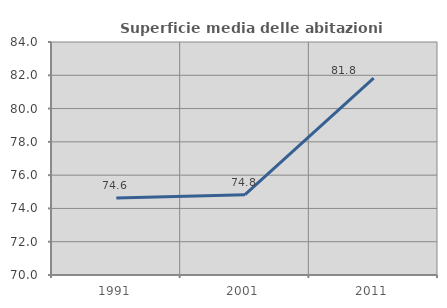
| Category | Superficie media delle abitazioni occupate |
|---|---|
| 1991.0 | 74.624 |
| 2001.0 | 74.829 |
| 2011.0 | 81.823 |